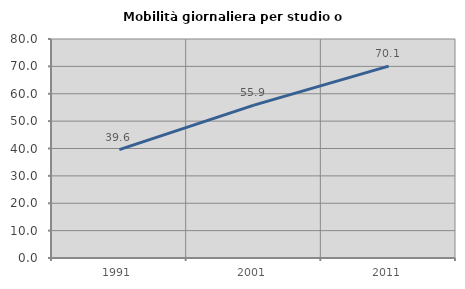
| Category | Mobilità giornaliera per studio o lavoro |
|---|---|
| 1991.0 | 39.602 |
| 2001.0 | 55.854 |
| 2011.0 | 70.085 |